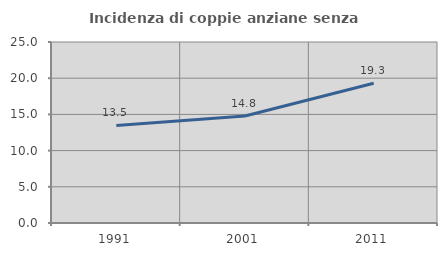
| Category | Incidenza di coppie anziane senza figli  |
|---|---|
| 1991.0 | 13.472 |
| 2001.0 | 14.773 |
| 2011.0 | 19.31 |